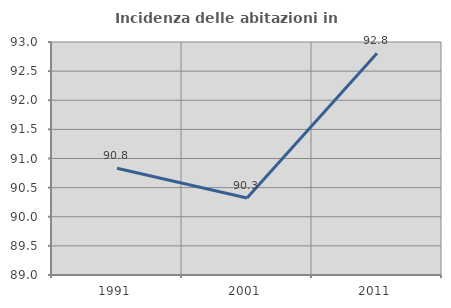
| Category | Incidenza delle abitazioni in proprietà  |
|---|---|
| 1991.0 | 90.833 |
| 2001.0 | 90.323 |
| 2011.0 | 92.806 |